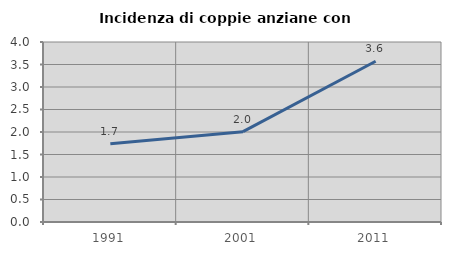
| Category | Incidenza di coppie anziane con figli |
|---|---|
| 1991.0 | 1.739 |
| 2001.0 | 2.008 |
| 2011.0 | 3.571 |